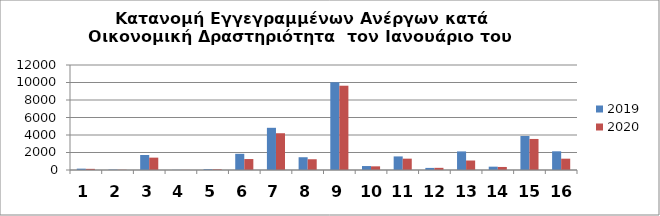
| Category | 2019 | 2020 |
|---|---|---|
| 0 | 155 | 131 |
| 1 | 46 | 27 |
| 2 | 1714 | 1413 |
| 3 | 13 | 12 |
| 4 | 92 | 80 |
| 5 | 1850 | 1253 |
| 6 | 4822 | 4202 |
| 7 | 1459 | 1228 |
| 8 | 10030 | 9632 |
| 9 | 453 | 419 |
| 10 | 1552 | 1296 |
| 11 | 239 | 247 |
| 12 | 2124 | 1085 |
| 13 | 381 | 347 |
| 14 | 3885 | 3548 |
| 15 | 2136 | 1294 |